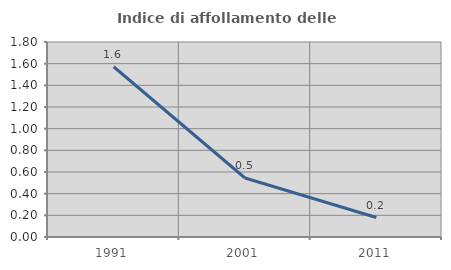
| Category | Indice di affollamento delle abitazioni  |
|---|---|
| 1991.0 | 1.572 |
| 2001.0 | 0.544 |
| 2011.0 | 0.18 |